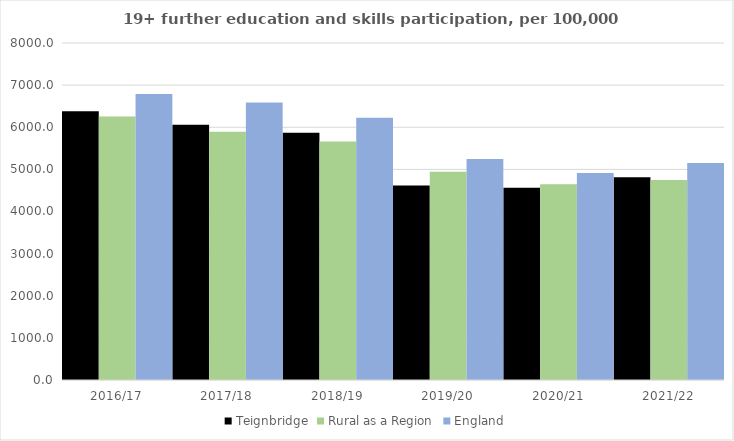
| Category | Teignbridge | Rural as a Region | England |
|---|---|---|---|
| 2016/17 | 6377 | 6253.401 | 6788 |
| 2017/18 | 6062 | 5892.029 | 6588 |
| 2018/19 | 5868 | 5661.873 | 6227 |
| 2019/20 | 4617 | 4943.801 | 5244 |
| 2020/21 | 4565 | 4646.727 | 4913 |
| 2021/22 | 4813 | 4747.049 | 5151 |